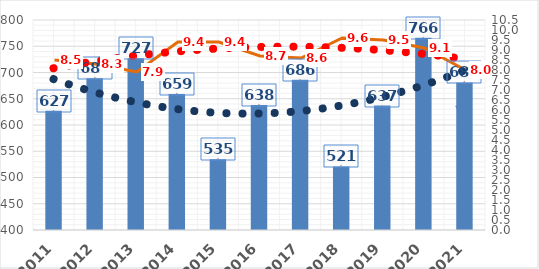
| Category | srážky [mm] |
|---|---|
| 2011.0 | 627 |
| 2012.0 | 689 |
| 2013.0 | 727 |
| 2014.0 | 659 |
| 2015.0 | 535 |
| 2016.0 | 638 |
| 2017.0 | 686 |
| 2018.0 | 521 |
| 2019.0 | 637 |
| 2020.0 | 766 |
| 2021.0 | 681 |